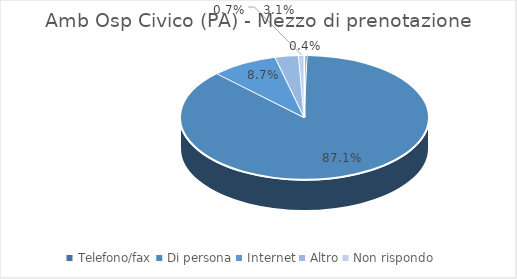
| Category | Amb Osp Civico (PA) |
|---|---|
| Telefono/fax | 0.004 |
| Di persona | 0.871 |
| Internet | 0.087 |
| Altro | 0.031 |
| Non rispondo | 0.007 |